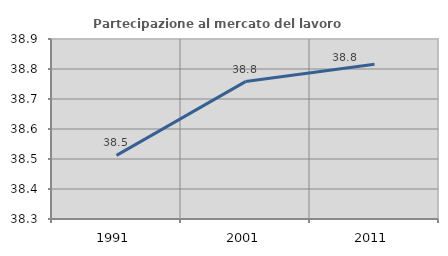
| Category | Partecipazione al mercato del lavoro  femminile |
|---|---|
| 1991.0 | 38.512 |
| 2001.0 | 38.758 |
| 2011.0 | 38.816 |